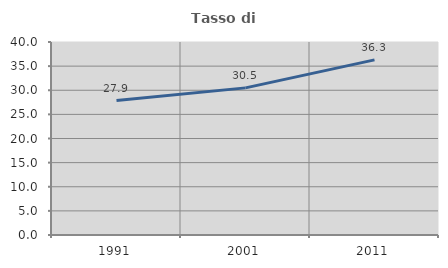
| Category | Tasso di occupazione   |
|---|---|
| 1991.0 | 27.853 |
| 2001.0 | 30.491 |
| 2011.0 | 36.302 |